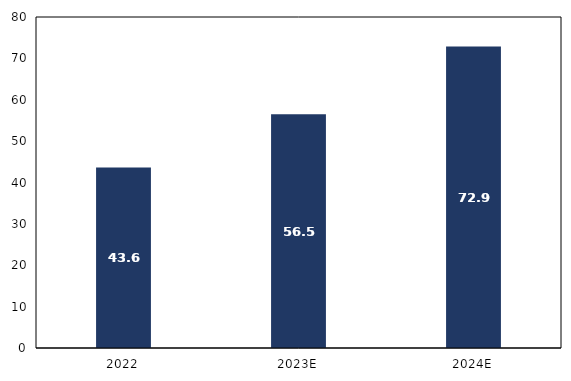
| Category | Series 0 |
|---|---|
| 2022 | 43.6 |
| 2023E | 56.5 |
| 2024E | 72.9 |